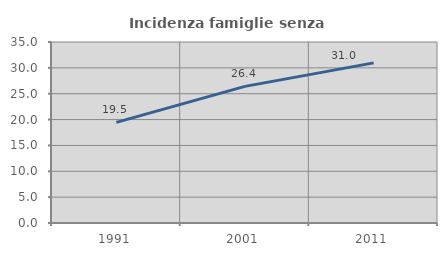
| Category | Incidenza famiglie senza nuclei |
|---|---|
| 1991.0 | 19.457 |
| 2001.0 | 26.415 |
| 2011.0 | 30.968 |